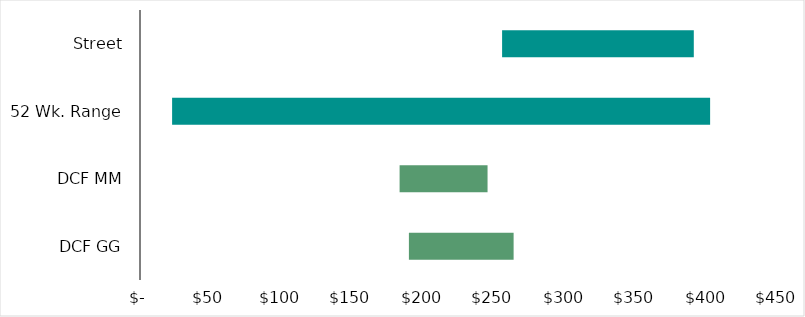
| Category | Series 0 | Series 1 |
|---|---|---|
| DCF GG | 189.369 | 73.742 |
| DCF MM | 182.818 | 61.939 |
| 52 Wk. Range | 22.61 | 378.88 |
| Street | 255 | 135 |